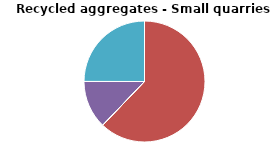
| Category | Series 0 |
|---|---|
| DRILLING AND BLASTING | 0 |
| MATERIAL PROCESSING | 19.7 |
| INTERNAL TRANSPORT | 0 |
| MATERIAL HANDLING OPERATION | 4.078 |
| WIND EROSION FROM STOCKPILES | 7.923 |